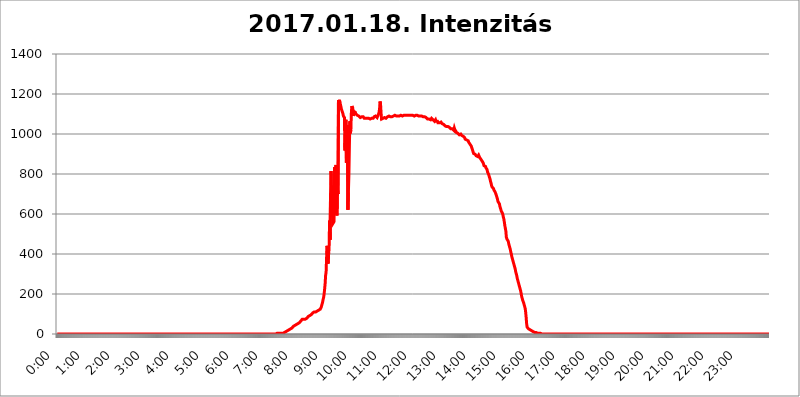
| Category | 2017.01.18. Intenzitás [W/m^2] |
|---|---|
| 0.0 | 0 |
| 0.0006944444444444445 | 0 |
| 0.001388888888888889 | 0 |
| 0.0020833333333333333 | 0 |
| 0.002777777777777778 | 0 |
| 0.003472222222222222 | 0 |
| 0.004166666666666667 | 0 |
| 0.004861111111111111 | 0 |
| 0.005555555555555556 | 0 |
| 0.0062499999999999995 | 0 |
| 0.006944444444444444 | 0 |
| 0.007638888888888889 | 0 |
| 0.008333333333333333 | 0 |
| 0.009027777777777779 | 0 |
| 0.009722222222222222 | 0 |
| 0.010416666666666666 | 0 |
| 0.011111111111111112 | 0 |
| 0.011805555555555555 | 0 |
| 0.012499999999999999 | 0 |
| 0.013194444444444444 | 0 |
| 0.013888888888888888 | 0 |
| 0.014583333333333332 | 0 |
| 0.015277777777777777 | 0 |
| 0.015972222222222224 | 0 |
| 0.016666666666666666 | 0 |
| 0.017361111111111112 | 0 |
| 0.018055555555555557 | 0 |
| 0.01875 | 0 |
| 0.019444444444444445 | 0 |
| 0.02013888888888889 | 0 |
| 0.020833333333333332 | 0 |
| 0.02152777777777778 | 0 |
| 0.022222222222222223 | 0 |
| 0.02291666666666667 | 0 |
| 0.02361111111111111 | 0 |
| 0.024305555555555556 | 0 |
| 0.024999999999999998 | 0 |
| 0.025694444444444447 | 0 |
| 0.02638888888888889 | 0 |
| 0.027083333333333334 | 0 |
| 0.027777777777777776 | 0 |
| 0.02847222222222222 | 0 |
| 0.029166666666666664 | 0 |
| 0.029861111111111113 | 0 |
| 0.030555555555555555 | 0 |
| 0.03125 | 0 |
| 0.03194444444444445 | 0 |
| 0.03263888888888889 | 0 |
| 0.03333333333333333 | 0 |
| 0.034027777777777775 | 0 |
| 0.034722222222222224 | 0 |
| 0.035416666666666666 | 0 |
| 0.036111111111111115 | 0 |
| 0.03680555555555556 | 0 |
| 0.0375 | 0 |
| 0.03819444444444444 | 0 |
| 0.03888888888888889 | 0 |
| 0.03958333333333333 | 0 |
| 0.04027777777777778 | 0 |
| 0.04097222222222222 | 0 |
| 0.041666666666666664 | 0 |
| 0.042361111111111106 | 0 |
| 0.04305555555555556 | 0 |
| 0.043750000000000004 | 0 |
| 0.044444444444444446 | 0 |
| 0.04513888888888889 | 0 |
| 0.04583333333333334 | 0 |
| 0.04652777777777778 | 0 |
| 0.04722222222222222 | 0 |
| 0.04791666666666666 | 0 |
| 0.04861111111111111 | 0 |
| 0.049305555555555554 | 0 |
| 0.049999999999999996 | 0 |
| 0.05069444444444445 | 0 |
| 0.051388888888888894 | 0 |
| 0.052083333333333336 | 0 |
| 0.05277777777777778 | 0 |
| 0.05347222222222222 | 0 |
| 0.05416666666666667 | 0 |
| 0.05486111111111111 | 0 |
| 0.05555555555555555 | 0 |
| 0.05625 | 0 |
| 0.05694444444444444 | 0 |
| 0.057638888888888885 | 0 |
| 0.05833333333333333 | 0 |
| 0.05902777777777778 | 0 |
| 0.059722222222222225 | 0 |
| 0.06041666666666667 | 0 |
| 0.061111111111111116 | 0 |
| 0.06180555555555556 | 0 |
| 0.0625 | 0 |
| 0.06319444444444444 | 0 |
| 0.06388888888888888 | 0 |
| 0.06458333333333334 | 0 |
| 0.06527777777777778 | 0 |
| 0.06597222222222222 | 0 |
| 0.06666666666666667 | 0 |
| 0.06736111111111111 | 0 |
| 0.06805555555555555 | 0 |
| 0.06874999999999999 | 0 |
| 0.06944444444444443 | 0 |
| 0.07013888888888889 | 0 |
| 0.07083333333333333 | 0 |
| 0.07152777777777779 | 0 |
| 0.07222222222222223 | 0 |
| 0.07291666666666667 | 0 |
| 0.07361111111111111 | 0 |
| 0.07430555555555556 | 0 |
| 0.075 | 0 |
| 0.07569444444444444 | 0 |
| 0.0763888888888889 | 0 |
| 0.07708333333333334 | 0 |
| 0.07777777777777778 | 0 |
| 0.07847222222222222 | 0 |
| 0.07916666666666666 | 0 |
| 0.0798611111111111 | 0 |
| 0.08055555555555556 | 0 |
| 0.08125 | 0 |
| 0.08194444444444444 | 0 |
| 0.08263888888888889 | 0 |
| 0.08333333333333333 | 0 |
| 0.08402777777777777 | 0 |
| 0.08472222222222221 | 0 |
| 0.08541666666666665 | 0 |
| 0.08611111111111112 | 0 |
| 0.08680555555555557 | 0 |
| 0.08750000000000001 | 0 |
| 0.08819444444444445 | 0 |
| 0.08888888888888889 | 0 |
| 0.08958333333333333 | 0 |
| 0.09027777777777778 | 0 |
| 0.09097222222222222 | 0 |
| 0.09166666666666667 | 0 |
| 0.09236111111111112 | 0 |
| 0.09305555555555556 | 0 |
| 0.09375 | 0 |
| 0.09444444444444444 | 0 |
| 0.09513888888888888 | 0 |
| 0.09583333333333333 | 0 |
| 0.09652777777777777 | 0 |
| 0.09722222222222222 | 0 |
| 0.09791666666666667 | 0 |
| 0.09861111111111111 | 0 |
| 0.09930555555555555 | 0 |
| 0.09999999999999999 | 0 |
| 0.10069444444444443 | 0 |
| 0.1013888888888889 | 0 |
| 0.10208333333333335 | 0 |
| 0.10277777777777779 | 0 |
| 0.10347222222222223 | 0 |
| 0.10416666666666667 | 0 |
| 0.10486111111111111 | 0 |
| 0.10555555555555556 | 0 |
| 0.10625 | 0 |
| 0.10694444444444444 | 0 |
| 0.1076388888888889 | 0 |
| 0.10833333333333334 | 0 |
| 0.10902777777777778 | 0 |
| 0.10972222222222222 | 0 |
| 0.1111111111111111 | 0 |
| 0.11180555555555556 | 0 |
| 0.11180555555555556 | 0 |
| 0.1125 | 0 |
| 0.11319444444444444 | 0 |
| 0.11388888888888889 | 0 |
| 0.11458333333333333 | 0 |
| 0.11527777777777777 | 0 |
| 0.11597222222222221 | 0 |
| 0.11666666666666665 | 0 |
| 0.1173611111111111 | 0 |
| 0.11805555555555557 | 0 |
| 0.11944444444444445 | 0 |
| 0.12013888888888889 | 0 |
| 0.12083333333333333 | 0 |
| 0.12152777777777778 | 0 |
| 0.12222222222222223 | 0 |
| 0.12291666666666667 | 0 |
| 0.12291666666666667 | 0 |
| 0.12361111111111112 | 0 |
| 0.12430555555555556 | 0 |
| 0.125 | 0 |
| 0.12569444444444444 | 0 |
| 0.12638888888888888 | 0 |
| 0.12708333333333333 | 0 |
| 0.16875 | 0 |
| 0.12847222222222224 | 0 |
| 0.12916666666666668 | 0 |
| 0.12986111111111112 | 0 |
| 0.13055555555555556 | 0 |
| 0.13125 | 0 |
| 0.13194444444444445 | 0 |
| 0.1326388888888889 | 0 |
| 0.13333333333333333 | 0 |
| 0.13402777777777777 | 0 |
| 0.13402777777777777 | 0 |
| 0.13472222222222222 | 0 |
| 0.13541666666666666 | 0 |
| 0.1361111111111111 | 0 |
| 0.13749999999999998 | 0 |
| 0.13819444444444443 | 0 |
| 0.1388888888888889 | 0 |
| 0.13958333333333334 | 0 |
| 0.14027777777777778 | 0 |
| 0.14097222222222222 | 0 |
| 0.14166666666666666 | 0 |
| 0.1423611111111111 | 0 |
| 0.14305555555555557 | 0 |
| 0.14375000000000002 | 0 |
| 0.14444444444444446 | 0 |
| 0.1451388888888889 | 0 |
| 0.1451388888888889 | 0 |
| 0.14652777777777778 | 0 |
| 0.14722222222222223 | 0 |
| 0.14791666666666667 | 0 |
| 0.1486111111111111 | 0 |
| 0.14930555555555555 | 0 |
| 0.15 | 0 |
| 0.15069444444444444 | 0 |
| 0.15138888888888888 | 0 |
| 0.15208333333333332 | 0 |
| 0.15277777777777776 | 0 |
| 0.15347222222222223 | 0 |
| 0.15416666666666667 | 0 |
| 0.15486111111111112 | 0 |
| 0.15555555555555556 | 0 |
| 0.15625 | 0 |
| 0.15694444444444444 | 0 |
| 0.15763888888888888 | 0 |
| 0.15833333333333333 | 0 |
| 0.15902777777777777 | 0 |
| 0.15972222222222224 | 0 |
| 0.16041666666666668 | 0 |
| 0.16111111111111112 | 0 |
| 0.16180555555555556 | 0 |
| 0.1625 | 0 |
| 0.16319444444444445 | 0 |
| 0.1638888888888889 | 0 |
| 0.16458333333333333 | 0 |
| 0.16527777777777777 | 0 |
| 0.16597222222222222 | 0 |
| 0.16666666666666666 | 0 |
| 0.1673611111111111 | 0 |
| 0.16805555555555554 | 0 |
| 0.16874999999999998 | 0 |
| 0.16944444444444443 | 0 |
| 0.17013888888888887 | 0 |
| 0.1708333333333333 | 0 |
| 0.17152777777777775 | 0 |
| 0.17222222222222225 | 0 |
| 0.1729166666666667 | 0 |
| 0.17361111111111113 | 0 |
| 0.17430555555555557 | 0 |
| 0.17500000000000002 | 0 |
| 0.17569444444444446 | 0 |
| 0.1763888888888889 | 0 |
| 0.17708333333333334 | 0 |
| 0.17777777777777778 | 0 |
| 0.17847222222222223 | 0 |
| 0.17916666666666667 | 0 |
| 0.1798611111111111 | 0 |
| 0.18055555555555555 | 0 |
| 0.18125 | 0 |
| 0.18194444444444444 | 0 |
| 0.1826388888888889 | 0 |
| 0.18333333333333335 | 0 |
| 0.1840277777777778 | 0 |
| 0.18472222222222223 | 0 |
| 0.18541666666666667 | 0 |
| 0.18611111111111112 | 0 |
| 0.18680555555555556 | 0 |
| 0.1875 | 0 |
| 0.18819444444444444 | 0 |
| 0.18888888888888888 | 0 |
| 0.18958333333333333 | 0 |
| 0.19027777777777777 | 0 |
| 0.1909722222222222 | 0 |
| 0.19166666666666665 | 0 |
| 0.19236111111111112 | 0 |
| 0.19305555555555554 | 0 |
| 0.19375 | 0 |
| 0.19444444444444445 | 0 |
| 0.1951388888888889 | 0 |
| 0.19583333333333333 | 0 |
| 0.19652777777777777 | 0 |
| 0.19722222222222222 | 0 |
| 0.19791666666666666 | 0 |
| 0.1986111111111111 | 0 |
| 0.19930555555555554 | 0 |
| 0.19999999999999998 | 0 |
| 0.20069444444444443 | 0 |
| 0.20138888888888887 | 0 |
| 0.2020833333333333 | 0 |
| 0.2027777777777778 | 0 |
| 0.2034722222222222 | 0 |
| 0.2041666666666667 | 0 |
| 0.20486111111111113 | 0 |
| 0.20555555555555557 | 0 |
| 0.20625000000000002 | 0 |
| 0.20694444444444446 | 0 |
| 0.2076388888888889 | 0 |
| 0.20833333333333334 | 0 |
| 0.20902777777777778 | 0 |
| 0.20972222222222223 | 0 |
| 0.21041666666666667 | 0 |
| 0.2111111111111111 | 0 |
| 0.21180555555555555 | 0 |
| 0.2125 | 0 |
| 0.21319444444444444 | 0 |
| 0.2138888888888889 | 0 |
| 0.21458333333333335 | 0 |
| 0.2152777777777778 | 0 |
| 0.21597222222222223 | 0 |
| 0.21666666666666667 | 0 |
| 0.21736111111111112 | 0 |
| 0.21805555555555556 | 0 |
| 0.21875 | 0 |
| 0.21944444444444444 | 0 |
| 0.22013888888888888 | 0 |
| 0.22083333333333333 | 0 |
| 0.22152777777777777 | 0 |
| 0.2222222222222222 | 0 |
| 0.22291666666666665 | 0 |
| 0.2236111111111111 | 0 |
| 0.22430555555555556 | 0 |
| 0.225 | 0 |
| 0.22569444444444445 | 0 |
| 0.2263888888888889 | 0 |
| 0.22708333333333333 | 0 |
| 0.22777777777777777 | 0 |
| 0.22847222222222222 | 0 |
| 0.22916666666666666 | 0 |
| 0.2298611111111111 | 0 |
| 0.23055555555555554 | 0 |
| 0.23124999999999998 | 0 |
| 0.23194444444444443 | 0 |
| 0.23263888888888887 | 0 |
| 0.2333333333333333 | 0 |
| 0.2340277777777778 | 0 |
| 0.2347222222222222 | 0 |
| 0.2354166666666667 | 0 |
| 0.23611111111111113 | 0 |
| 0.23680555555555557 | 0 |
| 0.23750000000000002 | 0 |
| 0.23819444444444446 | 0 |
| 0.2388888888888889 | 0 |
| 0.23958333333333334 | 0 |
| 0.24027777777777778 | 0 |
| 0.24097222222222223 | 0 |
| 0.24166666666666667 | 0 |
| 0.2423611111111111 | 0 |
| 0.24305555555555555 | 0 |
| 0.24375 | 0 |
| 0.24444444444444446 | 0 |
| 0.24513888888888888 | 0 |
| 0.24583333333333335 | 0 |
| 0.2465277777777778 | 0 |
| 0.24722222222222223 | 0 |
| 0.24791666666666667 | 0 |
| 0.24861111111111112 | 0 |
| 0.24930555555555556 | 0 |
| 0.25 | 0 |
| 0.25069444444444444 | 0 |
| 0.2513888888888889 | 0 |
| 0.2520833333333333 | 0 |
| 0.25277777777777777 | 0 |
| 0.2534722222222222 | 0 |
| 0.25416666666666665 | 0 |
| 0.2548611111111111 | 0 |
| 0.2555555555555556 | 0 |
| 0.25625000000000003 | 0 |
| 0.2569444444444445 | 0 |
| 0.2576388888888889 | 0 |
| 0.25833333333333336 | 0 |
| 0.2590277777777778 | 0 |
| 0.25972222222222224 | 0 |
| 0.2604166666666667 | 0 |
| 0.2611111111111111 | 0 |
| 0.26180555555555557 | 0 |
| 0.2625 | 0 |
| 0.26319444444444445 | 0 |
| 0.2638888888888889 | 0 |
| 0.26458333333333334 | 0 |
| 0.2652777777777778 | 0 |
| 0.2659722222222222 | 0 |
| 0.26666666666666666 | 0 |
| 0.2673611111111111 | 0 |
| 0.26805555555555555 | 0 |
| 0.26875 | 0 |
| 0.26944444444444443 | 0 |
| 0.2701388888888889 | 0 |
| 0.2708333333333333 | 0 |
| 0.27152777777777776 | 0 |
| 0.2722222222222222 | 0 |
| 0.27291666666666664 | 0 |
| 0.2736111111111111 | 0 |
| 0.2743055555555555 | 0 |
| 0.27499999999999997 | 0 |
| 0.27569444444444446 | 0 |
| 0.27638888888888885 | 0 |
| 0.27708333333333335 | 0 |
| 0.2777777777777778 | 0 |
| 0.27847222222222223 | 0 |
| 0.2791666666666667 | 0 |
| 0.2798611111111111 | 0 |
| 0.28055555555555556 | 0 |
| 0.28125 | 0 |
| 0.28194444444444444 | 0 |
| 0.2826388888888889 | 0 |
| 0.2833333333333333 | 0 |
| 0.28402777777777777 | 0 |
| 0.2847222222222222 | 0 |
| 0.28541666666666665 | 0 |
| 0.28611111111111115 | 0 |
| 0.28680555555555554 | 0 |
| 0.28750000000000003 | 0 |
| 0.2881944444444445 | 0 |
| 0.2888888888888889 | 0 |
| 0.28958333333333336 | 0 |
| 0.2902777777777778 | 0 |
| 0.29097222222222224 | 0 |
| 0.2916666666666667 | 0 |
| 0.2923611111111111 | 0 |
| 0.29305555555555557 | 0 |
| 0.29375 | 0 |
| 0.29444444444444445 | 0 |
| 0.2951388888888889 | 0 |
| 0.29583333333333334 | 0 |
| 0.2965277777777778 | 0 |
| 0.2972222222222222 | 0 |
| 0.29791666666666666 | 0 |
| 0.2986111111111111 | 0 |
| 0.29930555555555555 | 0 |
| 0.3 | 0 |
| 0.30069444444444443 | 0 |
| 0.3013888888888889 | 0 |
| 0.3020833333333333 | 0 |
| 0.30277777777777776 | 0 |
| 0.3034722222222222 | 0 |
| 0.30416666666666664 | 0 |
| 0.3048611111111111 | 0 |
| 0.3055555555555555 | 3.525 |
| 0.30624999999999997 | 0 |
| 0.3069444444444444 | 3.525 |
| 0.3076388888888889 | 0 |
| 0.30833333333333335 | 3.525 |
| 0.3090277777777778 | 3.525 |
| 0.30972222222222223 | 3.525 |
| 0.3104166666666667 | 3.525 |
| 0.3111111111111111 | 3.525 |
| 0.31180555555555556 | 3.525 |
| 0.3125 | 3.525 |
| 0.31319444444444444 | 3.525 |
| 0.3138888888888889 | 3.525 |
| 0.3145833333333333 | 3.525 |
| 0.31527777777777777 | 3.525 |
| 0.3159722222222222 | 3.525 |
| 0.31666666666666665 | 3.525 |
| 0.31736111111111115 | 3.525 |
| 0.31805555555555554 | 3.525 |
| 0.31875000000000003 | 7.887 |
| 0.3194444444444445 | 7.887 |
| 0.3201388888888889 | 7.887 |
| 0.32083333333333336 | 12.257 |
| 0.3215277777777778 | 12.257 |
| 0.32222222222222224 | 12.257 |
| 0.3229166666666667 | 16.636 |
| 0.3236111111111111 | 16.636 |
| 0.32430555555555557 | 16.636 |
| 0.325 | 21.024 |
| 0.32569444444444445 | 21.024 |
| 0.3263888888888889 | 25.419 |
| 0.32708333333333334 | 25.419 |
| 0.3277777777777778 | 25.419 |
| 0.3284722222222222 | 29.823 |
| 0.32916666666666666 | 29.823 |
| 0.3298611111111111 | 34.234 |
| 0.33055555555555555 | 34.234 |
| 0.33125 | 38.653 |
| 0.33194444444444443 | 38.653 |
| 0.3326388888888889 | 43.079 |
| 0.3333333333333333 | 43.079 |
| 0.3340277777777778 | 47.511 |
| 0.3347222222222222 | 47.511 |
| 0.3354166666666667 | 47.511 |
| 0.3361111111111111 | 51.951 |
| 0.3368055555555556 | 51.951 |
| 0.33749999999999997 | 51.951 |
| 0.33819444444444446 | 56.398 |
| 0.33888888888888885 | 56.398 |
| 0.33958333333333335 | 56.398 |
| 0.34027777777777773 | 60.85 |
| 0.34097222222222223 | 60.85 |
| 0.3416666666666666 | 65.31 |
| 0.3423611111111111 | 65.31 |
| 0.3430555555555555 | 69.775 |
| 0.34375 | 74.246 |
| 0.3444444444444445 | 74.246 |
| 0.3451388888888889 | 74.246 |
| 0.3458333333333334 | 74.246 |
| 0.34652777777777777 | 74.246 |
| 0.34722222222222227 | 74.246 |
| 0.34791666666666665 | 74.246 |
| 0.34861111111111115 | 74.246 |
| 0.34930555555555554 | 78.722 |
| 0.35000000000000003 | 78.722 |
| 0.3506944444444444 | 83.205 |
| 0.3513888888888889 | 83.205 |
| 0.3520833333333333 | 87.692 |
| 0.3527777777777778 | 87.692 |
| 0.3534722222222222 | 92.184 |
| 0.3541666666666667 | 92.184 |
| 0.3548611111111111 | 96.682 |
| 0.35555555555555557 | 96.682 |
| 0.35625 | 96.682 |
| 0.35694444444444445 | 101.184 |
| 0.3576388888888889 | 101.184 |
| 0.35833333333333334 | 105.69 |
| 0.3590277777777778 | 110.201 |
| 0.3597222222222222 | 110.201 |
| 0.36041666666666666 | 110.201 |
| 0.3611111111111111 | 110.201 |
| 0.36180555555555555 | 110.201 |
| 0.3625 | 110.201 |
| 0.36319444444444443 | 114.716 |
| 0.3638888888888889 | 114.716 |
| 0.3645833333333333 | 114.716 |
| 0.3652777777777778 | 119.235 |
| 0.3659722222222222 | 119.235 |
| 0.3666666666666667 | 119.235 |
| 0.3673611111111111 | 119.235 |
| 0.3680555555555556 | 123.758 |
| 0.36874999999999997 | 123.758 |
| 0.36944444444444446 | 128.284 |
| 0.37013888888888885 | 132.814 |
| 0.37083333333333335 | 141.884 |
| 0.37152777777777773 | 150.964 |
| 0.37222222222222223 | 160.056 |
| 0.3729166666666666 | 173.709 |
| 0.3736111111111111 | 182.82 |
| 0.3743055555555555 | 201.058 |
| 0.375 | 223.873 |
| 0.3756944444444445 | 251.251 |
| 0.3763888888888889 | 292.259 |
| 0.3770833333333334 | 310.44 |
| 0.37777777777777777 | 382.715 |
| 0.37847222222222227 | 440.702 |
| 0.37916666666666665 | 364.728 |
| 0.37986111111111115 | 351.198 |
| 0.38055555555555554 | 396.164 |
| 0.38125000000000003 | 427.39 |
| 0.3819444444444444 | 566.793 |
| 0.3826388888888889 | 471.582 |
| 0.3833333333333333 | 703.762 |
| 0.3840277777777778 | 814.519 |
| 0.3847222222222222 | 703.762 |
| 0.3854166666666667 | 583.779 |
| 0.3861111111111111 | 683.473 |
| 0.38680555555555557 | 553.986 |
| 0.3875 | 549.704 |
| 0.38819444444444445 | 562.53 |
| 0.3888888888888889 | 833.834 |
| 0.38958333333333334 | 675.311 |
| 0.3902777777777778 | 775.492 |
| 0.3909722222222222 | 845.365 |
| 0.39166666666666666 | 604.864 |
| 0.3923611111111111 | 592.233 |
| 0.39305555555555555 | 723.889 |
| 0.39375 | 699.717 |
| 0.39444444444444443 | 1170.358 |
| 0.3951388888888889 | 1154.814 |
| 0.3958333333333333 | 1170.358 |
| 0.3965277777777778 | 1154.814 |
| 0.3972222222222222 | 1147.086 |
| 0.3979166666666667 | 1135.543 |
| 0.3986111111111111 | 1124.056 |
| 0.3993055555555556 | 1116.426 |
| 0.39999999999999997 | 1108.816 |
| 0.40069444444444446 | 1101.226 |
| 0.40138888888888885 | 1089.873 |
| 0.40208333333333335 | 1086.097 |
| 0.40277777777777773 | 1082.324 |
| 0.40347222222222223 | 917.534 |
| 0.4041666666666666 | 1007.383 |
| 0.4048611111111111 | 1071.027 |
| 0.4055555555555555 | 856.855 |
| 0.40625 | 947.58 |
| 0.4069444444444445 | 1044.762 |
| 0.4076388888888889 | 621.613 |
| 0.4083333333333334 | 707.8 |
| 0.40902777777777777 | 795.074 |
| 0.40972222222222227 | 940.082 |
| 0.41041666666666665 | 1063.51 |
| 0.41111111111111115 | 1003.65 |
| 0.41180555555555554 | 1022.323 |
| 0.41250000000000003 | 1105.019 |
| 0.4131944444444444 | 1139.384 |
| 0.4138888888888889 | 1135.543 |
| 0.4145833333333333 | 1127.879 |
| 0.4152777777777778 | 1089.873 |
| 0.4159722222222222 | 1112.618 |
| 0.4166666666666667 | 1108.816 |
| 0.4173611111111111 | 1108.816 |
| 0.41805555555555557 | 1108.816 |
| 0.41875 | 1101.226 |
| 0.41944444444444445 | 1101.226 |
| 0.4201388888888889 | 1097.437 |
| 0.42083333333333334 | 1093.653 |
| 0.4215277777777778 | 1089.873 |
| 0.4222222222222222 | 1093.653 |
| 0.42291666666666666 | 1089.873 |
| 0.4236111111111111 | 1086.097 |
| 0.42430555555555555 | 1089.873 |
| 0.425 | 1082.324 |
| 0.42569444444444443 | 1086.097 |
| 0.4263888888888889 | 1086.097 |
| 0.4270833333333333 | 1086.097 |
| 0.4277777777777778 | 1086.097 |
| 0.4284722222222222 | 1086.097 |
| 0.4291666666666667 | 1086.097 |
| 0.4298611111111111 | 1086.097 |
| 0.4305555555555556 | 1078.555 |
| 0.43124999999999997 | 1082.324 |
| 0.43194444444444446 | 1078.555 |
| 0.43263888888888885 | 1078.555 |
| 0.43333333333333335 | 1082.324 |
| 0.43402777777777773 | 1082.324 |
| 0.43472222222222223 | 1078.555 |
| 0.4354166666666666 | 1078.555 |
| 0.4361111111111111 | 1078.555 |
| 0.4368055555555555 | 1078.555 |
| 0.4375 | 1078.555 |
| 0.4381944444444445 | 1082.324 |
| 0.4388888888888889 | 1074.789 |
| 0.4395833333333334 | 1074.789 |
| 0.44027777777777777 | 1074.789 |
| 0.44097222222222227 | 1078.555 |
| 0.44166666666666665 | 1078.555 |
| 0.44236111111111115 | 1082.324 |
| 0.44305555555555554 | 1078.555 |
| 0.44375000000000003 | 1082.324 |
| 0.4444444444444444 | 1086.097 |
| 0.4451388888888889 | 1082.324 |
| 0.4458333333333333 | 1086.097 |
| 0.4465277777777778 | 1089.873 |
| 0.4472222222222222 | 1086.097 |
| 0.4479166666666667 | 1086.097 |
| 0.4486111111111111 | 1082.324 |
| 0.44930555555555557 | 1086.097 |
| 0.45 | 1093.653 |
| 0.45069444444444445 | 1101.226 |
| 0.4513888888888889 | 1108.816 |
| 0.45208333333333334 | 1127.879 |
| 0.4527777777777778 | 1162.571 |
| 0.4534722222222222 | 1147.086 |
| 0.45416666666666666 | 1105.019 |
| 0.4548611111111111 | 1074.789 |
| 0.45555555555555555 | 1074.789 |
| 0.45625 | 1074.789 |
| 0.45694444444444443 | 1078.555 |
| 0.4576388888888889 | 1082.324 |
| 0.4583333333333333 | 1078.555 |
| 0.4590277777777778 | 1082.324 |
| 0.4597222222222222 | 1078.555 |
| 0.4604166666666667 | 1078.555 |
| 0.4611111111111111 | 1078.555 |
| 0.4618055555555556 | 1082.324 |
| 0.46249999999999997 | 1082.324 |
| 0.46319444444444446 | 1086.097 |
| 0.46388888888888885 | 1086.097 |
| 0.46458333333333335 | 1086.097 |
| 0.46527777777777773 | 1089.873 |
| 0.46597222222222223 | 1086.097 |
| 0.4666666666666666 | 1086.097 |
| 0.4673611111111111 | 1086.097 |
| 0.4680555555555555 | 1086.097 |
| 0.46875 | 1086.097 |
| 0.4694444444444445 | 1086.097 |
| 0.4701388888888889 | 1086.097 |
| 0.4708333333333334 | 1086.097 |
| 0.47152777777777777 | 1089.873 |
| 0.47222222222222227 | 1093.653 |
| 0.47291666666666665 | 1089.873 |
| 0.47361111111111115 | 1093.653 |
| 0.47430555555555554 | 1089.873 |
| 0.47500000000000003 | 1089.873 |
| 0.4756944444444444 | 1089.873 |
| 0.4763888888888889 | 1093.653 |
| 0.4770833333333333 | 1093.653 |
| 0.4777777777777778 | 1089.873 |
| 0.4784722222222222 | 1093.653 |
| 0.4791666666666667 | 1089.873 |
| 0.4798611111111111 | 1089.873 |
| 0.48055555555555557 | 1093.653 |
| 0.48125 | 1093.653 |
| 0.48194444444444445 | 1093.653 |
| 0.4826388888888889 | 1093.653 |
| 0.48333333333333334 | 1093.653 |
| 0.4840277777777778 | 1089.873 |
| 0.4847222222222222 | 1093.653 |
| 0.48541666666666666 | 1089.873 |
| 0.4861111111111111 | 1093.653 |
| 0.48680555555555555 | 1097.437 |
| 0.4875 | 1097.437 |
| 0.48819444444444443 | 1093.653 |
| 0.4888888888888889 | 1093.653 |
| 0.4895833333333333 | 1097.437 |
| 0.4902777777777778 | 1093.653 |
| 0.4909722222222222 | 1093.653 |
| 0.4916666666666667 | 1089.873 |
| 0.4923611111111111 | 1093.653 |
| 0.4930555555555556 | 1093.653 |
| 0.49374999999999997 | 1093.653 |
| 0.49444444444444446 | 1093.653 |
| 0.49513888888888885 | 1093.653 |
| 0.49583333333333335 | 1093.653 |
| 0.49652777777777773 | 1093.653 |
| 0.49722222222222223 | 1093.653 |
| 0.4979166666666666 | 1093.653 |
| 0.4986111111111111 | 1093.653 |
| 0.4993055555555555 | 1093.653 |
| 0.5 | 1089.873 |
| 0.5006944444444444 | 1089.873 |
| 0.5013888888888889 | 1093.653 |
| 0.5020833333333333 | 1089.873 |
| 0.5027777777777778 | 1093.653 |
| 0.5034722222222222 | 1093.653 |
| 0.5041666666666667 | 1089.873 |
| 0.5048611111111111 | 1093.653 |
| 0.5055555555555555 | 1089.873 |
| 0.50625 | 1089.873 |
| 0.5069444444444444 | 1089.873 |
| 0.5076388888888889 | 1089.873 |
| 0.5083333333333333 | 1089.873 |
| 0.5090277777777777 | 1089.873 |
| 0.5097222222222222 | 1086.097 |
| 0.5104166666666666 | 1089.873 |
| 0.5111111111111112 | 1089.873 |
| 0.5118055555555555 | 1086.097 |
| 0.5125000000000001 | 1086.097 |
| 0.5131944444444444 | 1086.097 |
| 0.513888888888889 | 1086.097 |
| 0.5145833333333333 | 1086.097 |
| 0.5152777777777778 | 1086.097 |
| 0.5159722222222222 | 1086.097 |
| 0.5166666666666667 | 1086.097 |
| 0.517361111111111 | 1082.324 |
| 0.5180555555555556 | 1078.555 |
| 0.5187499999999999 | 1078.555 |
| 0.5194444444444445 | 1074.789 |
| 0.5201388888888888 | 1074.789 |
| 0.5208333333333334 | 1074.789 |
| 0.5215277777777778 | 1074.789 |
| 0.5222222222222223 | 1074.789 |
| 0.5229166666666667 | 1071.027 |
| 0.5236111111111111 | 1071.027 |
| 0.5243055555555556 | 1074.789 |
| 0.525 | 1078.555 |
| 0.5256944444444445 | 1078.555 |
| 0.5263888888888889 | 1078.555 |
| 0.5270833333333333 | 1071.027 |
| 0.5277777777777778 | 1071.027 |
| 0.5284722222222222 | 1067.267 |
| 0.5291666666666667 | 1063.51 |
| 0.5298611111111111 | 1063.51 |
| 0.5305555555555556 | 1071.027 |
| 0.53125 | 1063.51 |
| 0.5319444444444444 | 1059.756 |
| 0.5326388888888889 | 1059.756 |
| 0.5333333333333333 | 1063.51 |
| 0.5340277777777778 | 1056.004 |
| 0.5347222222222222 | 1059.756 |
| 0.5354166666666667 | 1059.756 |
| 0.5361111111111111 | 1056.004 |
| 0.5368055555555555 | 1059.756 |
| 0.5375 | 1059.756 |
| 0.5381944444444444 | 1059.756 |
| 0.5388888888888889 | 1056.004 |
| 0.5395833333333333 | 1052.255 |
| 0.5402777777777777 | 1056.004 |
| 0.5409722222222222 | 1052.255 |
| 0.5416666666666666 | 1048.508 |
| 0.5423611111111112 | 1048.508 |
| 0.5430555555555555 | 1048.508 |
| 0.5437500000000001 | 1041.019 |
| 0.5444444444444444 | 1037.277 |
| 0.545138888888889 | 1041.019 |
| 0.5458333333333333 | 1037.277 |
| 0.5465277777777778 | 1037.277 |
| 0.5472222222222222 | 1037.277 |
| 0.5479166666666667 | 1037.277 |
| 0.548611111111111 | 1037.277 |
| 0.5493055555555556 | 1037.277 |
| 0.5499999999999999 | 1033.537 |
| 0.5506944444444445 | 1033.537 |
| 0.5513888888888888 | 1029.798 |
| 0.5520833333333334 | 1026.06 |
| 0.5527777777777778 | 1022.323 |
| 0.5534722222222223 | 1022.323 |
| 0.5541666666666667 | 1026.06 |
| 0.5548611111111111 | 1026.06 |
| 0.5555555555555556 | 1026.06 |
| 0.55625 | 1018.587 |
| 0.5569444444444445 | 1029.798 |
| 0.5576388888888889 | 1022.323 |
| 0.5583333333333333 | 1018.587 |
| 0.5590277777777778 | 1014.852 |
| 0.5597222222222222 | 1007.383 |
| 0.5604166666666667 | 1007.383 |
| 0.5611111111111111 | 1003.65 |
| 0.5618055555555556 | 1003.65 |
| 0.5625 | 1003.65 |
| 0.5631944444444444 | 999.916 |
| 0.5638888888888889 | 996.182 |
| 0.5645833333333333 | 999.916 |
| 0.5652777777777778 | 996.182 |
| 0.5659722222222222 | 999.916 |
| 0.5666666666666667 | 996.182 |
| 0.5673611111111111 | 992.448 |
| 0.5680555555555555 | 992.448 |
| 0.56875 | 992.448 |
| 0.5694444444444444 | 988.714 |
| 0.5701388888888889 | 984.98 |
| 0.5708333333333333 | 984.98 |
| 0.5715277777777777 | 981.244 |
| 0.5722222222222222 | 973.772 |
| 0.5729166666666666 | 970.034 |
| 0.5736111111111112 | 970.034 |
| 0.5743055555555555 | 970.034 |
| 0.5750000000000001 | 970.034 |
| 0.5756944444444444 | 966.295 |
| 0.576388888888889 | 966.295 |
| 0.5770833333333333 | 958.814 |
| 0.5777777777777778 | 958.814 |
| 0.5784722222222222 | 955.071 |
| 0.5791666666666667 | 947.58 |
| 0.579861111111111 | 943.832 |
| 0.5805555555555556 | 940.082 |
| 0.5812499999999999 | 932.576 |
| 0.5819444444444445 | 925.06 |
| 0.5826388888888888 | 917.534 |
| 0.5833333333333334 | 909.996 |
| 0.5840277777777778 | 902.447 |
| 0.5847222222222223 | 898.668 |
| 0.5854166666666667 | 898.668 |
| 0.5861111111111111 | 898.668 |
| 0.5868055555555556 | 894.885 |
| 0.5875 | 891.099 |
| 0.5881944444444445 | 887.309 |
| 0.5888888888888889 | 887.309 |
| 0.5895833333333333 | 887.309 |
| 0.5902777777777778 | 891.099 |
| 0.5909722222222222 | 894.885 |
| 0.5916666666666667 | 891.099 |
| 0.5923611111111111 | 883.516 |
| 0.5930555555555556 | 879.719 |
| 0.59375 | 879.719 |
| 0.5944444444444444 | 872.114 |
| 0.5951388888888889 | 868.305 |
| 0.5958333333333333 | 864.493 |
| 0.5965277777777778 | 860.676 |
| 0.5972222222222222 | 856.855 |
| 0.5979166666666667 | 849.199 |
| 0.5986111111111111 | 841.526 |
| 0.5993055555555555 | 845.365 |
| 0.6 | 845.365 |
| 0.6006944444444444 | 837.682 |
| 0.6013888888888889 | 829.981 |
| 0.6020833333333333 | 826.123 |
| 0.6027777777777777 | 822.26 |
| 0.6034722222222222 | 810.641 |
| 0.6041666666666666 | 806.757 |
| 0.6048611111111112 | 798.974 |
| 0.6055555555555555 | 791.169 |
| 0.6062500000000001 | 783.342 |
| 0.6069444444444444 | 775.492 |
| 0.607638888888889 | 763.674 |
| 0.6083333333333333 | 755.766 |
| 0.6090277777777778 | 743.859 |
| 0.6097222222222222 | 735.89 |
| 0.6104166666666667 | 739.877 |
| 0.611111111111111 | 731.896 |
| 0.6118055555555556 | 727.896 |
| 0.6124999999999999 | 719.877 |
| 0.6131944444444445 | 715.858 |
| 0.6138888888888888 | 711.832 |
| 0.6145833333333334 | 711.832 |
| 0.6152777777777778 | 699.717 |
| 0.6159722222222223 | 691.608 |
| 0.6166666666666667 | 683.473 |
| 0.6173611111111111 | 675.311 |
| 0.6180555555555556 | 663.019 |
| 0.61875 | 658.909 |
| 0.6194444444444445 | 658.909 |
| 0.6201388888888889 | 650.667 |
| 0.6208333333333333 | 638.256 |
| 0.6215277777777778 | 629.948 |
| 0.6222222222222222 | 621.613 |
| 0.6229166666666667 | 613.252 |
| 0.6236111111111111 | 609.062 |
| 0.6243055555555556 | 604.864 |
| 0.625 | 596.45 |
| 0.6256944444444444 | 583.779 |
| 0.6263888888888889 | 575.299 |
| 0.6270833333333333 | 558.261 |
| 0.6277777777777778 | 541.121 |
| 0.6284722222222222 | 528.2 |
| 0.6291666666666667 | 515.223 |
| 0.6298611111111111 | 484.735 |
| 0.6305555555555555 | 475.972 |
| 0.63125 | 480.356 |
| 0.6319444444444444 | 471.582 |
| 0.6326388888888889 | 462.786 |
| 0.6333333333333333 | 449.551 |
| 0.6340277777777777 | 440.702 |
| 0.6347222222222222 | 431.833 |
| 0.6354166666666666 | 422.943 |
| 0.6361111111111112 | 409.574 |
| 0.6368055555555555 | 400.638 |
| 0.6375000000000001 | 387.202 |
| 0.6381944444444444 | 378.224 |
| 0.638888888888889 | 369.23 |
| 0.6395833333333333 | 360.221 |
| 0.6402777777777778 | 351.198 |
| 0.6409722222222222 | 342.162 |
| 0.6416666666666667 | 333.113 |
| 0.642361111111111 | 324.052 |
| 0.6430555555555556 | 310.44 |
| 0.6437499999999999 | 301.354 |
| 0.6444444444444445 | 292.259 |
| 0.6451388888888888 | 278.603 |
| 0.6458333333333334 | 269.49 |
| 0.6465277777777778 | 260.373 |
| 0.6472222222222223 | 251.251 |
| 0.6479166666666667 | 242.127 |
| 0.6486111111111111 | 233 |
| 0.6493055555555556 | 223.873 |
| 0.65 | 214.746 |
| 0.6506944444444445 | 201.058 |
| 0.6513888888888889 | 187.378 |
| 0.6520833333333333 | 178.264 |
| 0.6527777777777778 | 169.156 |
| 0.6534722222222222 | 164.605 |
| 0.6541666666666667 | 155.509 |
| 0.6548611111111111 | 146.423 |
| 0.6555555555555556 | 137.347 |
| 0.65625 | 128.284 |
| 0.6569444444444444 | 110.201 |
| 0.6576388888888889 | 83.205 |
| 0.6583333333333333 | 51.951 |
| 0.6590277777777778 | 34.234 |
| 0.6597222222222222 | 29.823 |
| 0.6604166666666667 | 29.823 |
| 0.6611111111111111 | 25.419 |
| 0.6618055555555555 | 25.419 |
| 0.6625 | 25.419 |
| 0.6631944444444444 | 21.024 |
| 0.6638888888888889 | 21.024 |
| 0.6645833333333333 | 21.024 |
| 0.6652777777777777 | 16.636 |
| 0.6659722222222222 | 16.636 |
| 0.6666666666666666 | 16.636 |
| 0.6673611111111111 | 12.257 |
| 0.6680555555555556 | 12.257 |
| 0.6687500000000001 | 12.257 |
| 0.6694444444444444 | 7.887 |
| 0.6701388888888888 | 7.887 |
| 0.6708333333333334 | 7.887 |
| 0.6715277777777778 | 7.887 |
| 0.6722222222222222 | 3.525 |
| 0.6729166666666666 | 3.525 |
| 0.6736111111111112 | 3.525 |
| 0.6743055555555556 | 3.525 |
| 0.6749999999999999 | 3.525 |
| 0.6756944444444444 | 3.525 |
| 0.6763888888888889 | 3.525 |
| 0.6770833333333334 | 3.525 |
| 0.6777777777777777 | 3.525 |
| 0.6784722222222223 | 0 |
| 0.6791666666666667 | 0 |
| 0.6798611111111111 | 0 |
| 0.6805555555555555 | 0 |
| 0.68125 | 0 |
| 0.6819444444444445 | 0 |
| 0.6826388888888889 | 0 |
| 0.6833333333333332 | 0 |
| 0.6840277777777778 | 0 |
| 0.6847222222222222 | 0 |
| 0.6854166666666667 | 0 |
| 0.686111111111111 | 0 |
| 0.6868055555555556 | 0 |
| 0.6875 | 0 |
| 0.6881944444444444 | 0 |
| 0.688888888888889 | 0 |
| 0.6895833333333333 | 0 |
| 0.6902777777777778 | 0 |
| 0.6909722222222222 | 0 |
| 0.6916666666666668 | 0 |
| 0.6923611111111111 | 0 |
| 0.6930555555555555 | 0 |
| 0.69375 | 0 |
| 0.6944444444444445 | 0 |
| 0.6951388888888889 | 0 |
| 0.6958333333333333 | 0 |
| 0.6965277777777777 | 0 |
| 0.6972222222222223 | 0 |
| 0.6979166666666666 | 0 |
| 0.6986111111111111 | 0 |
| 0.6993055555555556 | 0 |
| 0.7000000000000001 | 0 |
| 0.7006944444444444 | 0 |
| 0.7013888888888888 | 0 |
| 0.7020833333333334 | 0 |
| 0.7027777777777778 | 0 |
| 0.7034722222222222 | 0 |
| 0.7041666666666666 | 0 |
| 0.7048611111111112 | 0 |
| 0.7055555555555556 | 0 |
| 0.7062499999999999 | 0 |
| 0.7069444444444444 | 0 |
| 0.7076388888888889 | 0 |
| 0.7083333333333334 | 0 |
| 0.7090277777777777 | 0 |
| 0.7097222222222223 | 0 |
| 0.7104166666666667 | 0 |
| 0.7111111111111111 | 0 |
| 0.7118055555555555 | 0 |
| 0.7125 | 0 |
| 0.7131944444444445 | 0 |
| 0.7138888888888889 | 0 |
| 0.7145833333333332 | 0 |
| 0.7152777777777778 | 0 |
| 0.7159722222222222 | 0 |
| 0.7166666666666667 | 0 |
| 0.717361111111111 | 0 |
| 0.7180555555555556 | 0 |
| 0.71875 | 0 |
| 0.7194444444444444 | 0 |
| 0.720138888888889 | 0 |
| 0.7208333333333333 | 0 |
| 0.7215277777777778 | 0 |
| 0.7222222222222222 | 0 |
| 0.7229166666666668 | 0 |
| 0.7236111111111111 | 0 |
| 0.7243055555555555 | 0 |
| 0.725 | 0 |
| 0.7256944444444445 | 0 |
| 0.7263888888888889 | 0 |
| 0.7270833333333333 | 0 |
| 0.7277777777777777 | 0 |
| 0.7284722222222223 | 0 |
| 0.7291666666666666 | 0 |
| 0.7298611111111111 | 0 |
| 0.7305555555555556 | 0 |
| 0.7312500000000001 | 0 |
| 0.7319444444444444 | 0 |
| 0.7326388888888888 | 0 |
| 0.7333333333333334 | 0 |
| 0.7340277777777778 | 0 |
| 0.7347222222222222 | 0 |
| 0.7354166666666666 | 0 |
| 0.7361111111111112 | 0 |
| 0.7368055555555556 | 0 |
| 0.7374999999999999 | 0 |
| 0.7381944444444444 | 0 |
| 0.7388888888888889 | 0 |
| 0.7395833333333334 | 0 |
| 0.7402777777777777 | 0 |
| 0.7409722222222223 | 0 |
| 0.7416666666666667 | 0 |
| 0.7423611111111111 | 0 |
| 0.7430555555555555 | 0 |
| 0.74375 | 0 |
| 0.7444444444444445 | 0 |
| 0.7451388888888889 | 0 |
| 0.7458333333333332 | 0 |
| 0.7465277777777778 | 0 |
| 0.7472222222222222 | 0 |
| 0.7479166666666667 | 0 |
| 0.748611111111111 | 0 |
| 0.7493055555555556 | 0 |
| 0.75 | 0 |
| 0.7506944444444444 | 0 |
| 0.751388888888889 | 0 |
| 0.7520833333333333 | 0 |
| 0.7527777777777778 | 0 |
| 0.7534722222222222 | 0 |
| 0.7541666666666668 | 0 |
| 0.7548611111111111 | 0 |
| 0.7555555555555555 | 0 |
| 0.75625 | 0 |
| 0.7569444444444445 | 0 |
| 0.7576388888888889 | 0 |
| 0.7583333333333333 | 0 |
| 0.7590277777777777 | 0 |
| 0.7597222222222223 | 0 |
| 0.7604166666666666 | 0 |
| 0.7611111111111111 | 0 |
| 0.7618055555555556 | 0 |
| 0.7625000000000001 | 0 |
| 0.7631944444444444 | 0 |
| 0.7638888888888888 | 0 |
| 0.7645833333333334 | 0 |
| 0.7652777777777778 | 0 |
| 0.7659722222222222 | 0 |
| 0.7666666666666666 | 0 |
| 0.7673611111111112 | 0 |
| 0.7680555555555556 | 0 |
| 0.7687499999999999 | 0 |
| 0.7694444444444444 | 0 |
| 0.7701388888888889 | 0 |
| 0.7708333333333334 | 0 |
| 0.7715277777777777 | 0 |
| 0.7722222222222223 | 0 |
| 0.7729166666666667 | 0 |
| 0.7736111111111111 | 0 |
| 0.7743055555555555 | 0 |
| 0.775 | 0 |
| 0.7756944444444445 | 0 |
| 0.7763888888888889 | 0 |
| 0.7770833333333332 | 0 |
| 0.7777777777777778 | 0 |
| 0.7784722222222222 | 0 |
| 0.7791666666666667 | 0 |
| 0.779861111111111 | 0 |
| 0.7805555555555556 | 0 |
| 0.78125 | 0 |
| 0.7819444444444444 | 0 |
| 0.782638888888889 | 0 |
| 0.7833333333333333 | 0 |
| 0.7840277777777778 | 0 |
| 0.7847222222222222 | 0 |
| 0.7854166666666668 | 0 |
| 0.7861111111111111 | 0 |
| 0.7868055555555555 | 0 |
| 0.7875 | 0 |
| 0.7881944444444445 | 0 |
| 0.7888888888888889 | 0 |
| 0.7895833333333333 | 0 |
| 0.7902777777777777 | 0 |
| 0.7909722222222223 | 0 |
| 0.7916666666666666 | 0 |
| 0.7923611111111111 | 0 |
| 0.7930555555555556 | 0 |
| 0.7937500000000001 | 0 |
| 0.7944444444444444 | 0 |
| 0.7951388888888888 | 0 |
| 0.7958333333333334 | 0 |
| 0.7965277777777778 | 0 |
| 0.7972222222222222 | 0 |
| 0.7979166666666666 | 0 |
| 0.7986111111111112 | 0 |
| 0.7993055555555556 | 0 |
| 0.7999999999999999 | 0 |
| 0.8006944444444444 | 0 |
| 0.8013888888888889 | 0 |
| 0.8020833333333334 | 0 |
| 0.8027777777777777 | 0 |
| 0.8034722222222223 | 0 |
| 0.8041666666666667 | 0 |
| 0.8048611111111111 | 0 |
| 0.8055555555555555 | 0 |
| 0.80625 | 0 |
| 0.8069444444444445 | 0 |
| 0.8076388888888889 | 0 |
| 0.8083333333333332 | 0 |
| 0.8090277777777778 | 0 |
| 0.8097222222222222 | 0 |
| 0.8104166666666667 | 0 |
| 0.811111111111111 | 0 |
| 0.8118055555555556 | 0 |
| 0.8125 | 0 |
| 0.8131944444444444 | 0 |
| 0.813888888888889 | 0 |
| 0.8145833333333333 | 0 |
| 0.8152777777777778 | 0 |
| 0.8159722222222222 | 0 |
| 0.8166666666666668 | 0 |
| 0.8173611111111111 | 0 |
| 0.8180555555555555 | 0 |
| 0.81875 | 0 |
| 0.8194444444444445 | 0 |
| 0.8201388888888889 | 0 |
| 0.8208333333333333 | 0 |
| 0.8215277777777777 | 0 |
| 0.8222222222222223 | 0 |
| 0.8229166666666666 | 0 |
| 0.8236111111111111 | 0 |
| 0.8243055555555556 | 0 |
| 0.8250000000000001 | 0 |
| 0.8256944444444444 | 0 |
| 0.8263888888888888 | 0 |
| 0.8270833333333334 | 0 |
| 0.8277777777777778 | 0 |
| 0.8284722222222222 | 0 |
| 0.8291666666666666 | 0 |
| 0.8298611111111112 | 0 |
| 0.8305555555555556 | 0 |
| 0.8312499999999999 | 0 |
| 0.8319444444444444 | 0 |
| 0.8326388888888889 | 0 |
| 0.8333333333333334 | 0 |
| 0.8340277777777777 | 0 |
| 0.8347222222222223 | 0 |
| 0.8354166666666667 | 0 |
| 0.8361111111111111 | 0 |
| 0.8368055555555555 | 0 |
| 0.8375 | 0 |
| 0.8381944444444445 | 0 |
| 0.8388888888888889 | 0 |
| 0.8395833333333332 | 0 |
| 0.8402777777777778 | 0 |
| 0.8409722222222222 | 0 |
| 0.8416666666666667 | 0 |
| 0.842361111111111 | 0 |
| 0.8430555555555556 | 0 |
| 0.84375 | 0 |
| 0.8444444444444444 | 0 |
| 0.845138888888889 | 0 |
| 0.8458333333333333 | 0 |
| 0.8465277777777778 | 0 |
| 0.8472222222222222 | 0 |
| 0.8479166666666668 | 0 |
| 0.8486111111111111 | 0 |
| 0.8493055555555555 | 0 |
| 0.85 | 0 |
| 0.8506944444444445 | 0 |
| 0.8513888888888889 | 0 |
| 0.8520833333333333 | 0 |
| 0.8527777777777777 | 0 |
| 0.8534722222222223 | 0 |
| 0.8541666666666666 | 0 |
| 0.8548611111111111 | 0 |
| 0.8555555555555556 | 0 |
| 0.8562500000000001 | 0 |
| 0.8569444444444444 | 0 |
| 0.8576388888888888 | 0 |
| 0.8583333333333334 | 0 |
| 0.8590277777777778 | 0 |
| 0.8597222222222222 | 0 |
| 0.8604166666666666 | 0 |
| 0.8611111111111112 | 0 |
| 0.8618055555555556 | 0 |
| 0.8624999999999999 | 0 |
| 0.8631944444444444 | 0 |
| 0.8638888888888889 | 0 |
| 0.8645833333333334 | 0 |
| 0.8652777777777777 | 0 |
| 0.8659722222222223 | 0 |
| 0.8666666666666667 | 0 |
| 0.8673611111111111 | 0 |
| 0.8680555555555555 | 0 |
| 0.86875 | 0 |
| 0.8694444444444445 | 0 |
| 0.8701388888888889 | 0 |
| 0.8708333333333332 | 0 |
| 0.8715277777777778 | 0 |
| 0.8722222222222222 | 0 |
| 0.8729166666666667 | 0 |
| 0.873611111111111 | 0 |
| 0.8743055555555556 | 0 |
| 0.875 | 0 |
| 0.8756944444444444 | 0 |
| 0.876388888888889 | 0 |
| 0.8770833333333333 | 0 |
| 0.8777777777777778 | 0 |
| 0.8784722222222222 | 0 |
| 0.8791666666666668 | 0 |
| 0.8798611111111111 | 0 |
| 0.8805555555555555 | 0 |
| 0.88125 | 0 |
| 0.8819444444444445 | 0 |
| 0.8826388888888889 | 0 |
| 0.8833333333333333 | 0 |
| 0.8840277777777777 | 0 |
| 0.8847222222222223 | 0 |
| 0.8854166666666666 | 0 |
| 0.8861111111111111 | 0 |
| 0.8868055555555556 | 0 |
| 0.8875000000000001 | 0 |
| 0.8881944444444444 | 0 |
| 0.8888888888888888 | 0 |
| 0.8895833333333334 | 0 |
| 0.8902777777777778 | 0 |
| 0.8909722222222222 | 0 |
| 0.8916666666666666 | 0 |
| 0.8923611111111112 | 0 |
| 0.8930555555555556 | 0 |
| 0.8937499999999999 | 0 |
| 0.8944444444444444 | 0 |
| 0.8951388888888889 | 0 |
| 0.8958333333333334 | 0 |
| 0.8965277777777777 | 0 |
| 0.8972222222222223 | 0 |
| 0.8979166666666667 | 0 |
| 0.8986111111111111 | 0 |
| 0.8993055555555555 | 0 |
| 0.9 | 0 |
| 0.9006944444444445 | 0 |
| 0.9013888888888889 | 0 |
| 0.9020833333333332 | 0 |
| 0.9027777777777778 | 0 |
| 0.9034722222222222 | 0 |
| 0.9041666666666667 | 0 |
| 0.904861111111111 | 0 |
| 0.9055555555555556 | 0 |
| 0.90625 | 0 |
| 0.9069444444444444 | 0 |
| 0.907638888888889 | 0 |
| 0.9083333333333333 | 0 |
| 0.9090277777777778 | 0 |
| 0.9097222222222222 | 0 |
| 0.9104166666666668 | 0 |
| 0.9111111111111111 | 0 |
| 0.9118055555555555 | 0 |
| 0.9125 | 0 |
| 0.9131944444444445 | 0 |
| 0.9138888888888889 | 0 |
| 0.9145833333333333 | 0 |
| 0.9152777777777777 | 0 |
| 0.9159722222222223 | 0 |
| 0.9166666666666666 | 0 |
| 0.9173611111111111 | 0 |
| 0.9180555555555556 | 0 |
| 0.9187500000000001 | 0 |
| 0.9194444444444444 | 0 |
| 0.9201388888888888 | 0 |
| 0.9208333333333334 | 0 |
| 0.9215277777777778 | 0 |
| 0.9222222222222222 | 0 |
| 0.9229166666666666 | 0 |
| 0.9236111111111112 | 0 |
| 0.9243055555555556 | 0 |
| 0.9249999999999999 | 0 |
| 0.9256944444444444 | 0 |
| 0.9263888888888889 | 0 |
| 0.9270833333333334 | 0 |
| 0.9277777777777777 | 0 |
| 0.9284722222222223 | 0 |
| 0.9291666666666667 | 0 |
| 0.9298611111111111 | 0 |
| 0.9305555555555555 | 0 |
| 0.93125 | 0 |
| 0.9319444444444445 | 0 |
| 0.9326388888888889 | 0 |
| 0.9333333333333332 | 0 |
| 0.9340277777777778 | 0 |
| 0.9347222222222222 | 0 |
| 0.9354166666666667 | 0 |
| 0.936111111111111 | 0 |
| 0.9368055555555556 | 0 |
| 0.9375 | 0 |
| 0.9381944444444444 | 0 |
| 0.938888888888889 | 0 |
| 0.9395833333333333 | 0 |
| 0.9402777777777778 | 0 |
| 0.9409722222222222 | 0 |
| 0.9416666666666668 | 0 |
| 0.9423611111111111 | 0 |
| 0.9430555555555555 | 0 |
| 0.94375 | 0 |
| 0.9444444444444445 | 0 |
| 0.9451388888888889 | 0 |
| 0.9458333333333333 | 0 |
| 0.9465277777777777 | 0 |
| 0.9472222222222223 | 0 |
| 0.9479166666666666 | 0 |
| 0.9486111111111111 | 0 |
| 0.9493055555555556 | 0 |
| 0.9500000000000001 | 0 |
| 0.9506944444444444 | 0 |
| 0.9513888888888888 | 0 |
| 0.9520833333333334 | 0 |
| 0.9527777777777778 | 0 |
| 0.9534722222222222 | 0 |
| 0.9541666666666666 | 0 |
| 0.9548611111111112 | 0 |
| 0.9555555555555556 | 0 |
| 0.9562499999999999 | 0 |
| 0.9569444444444444 | 0 |
| 0.9576388888888889 | 0 |
| 0.9583333333333334 | 0 |
| 0.9590277777777777 | 0 |
| 0.9597222222222223 | 0 |
| 0.9604166666666667 | 0 |
| 0.9611111111111111 | 0 |
| 0.9618055555555555 | 0 |
| 0.9625 | 0 |
| 0.9631944444444445 | 0 |
| 0.9638888888888889 | 0 |
| 0.9645833333333332 | 0 |
| 0.9652777777777778 | 0 |
| 0.9659722222222222 | 0 |
| 0.9666666666666667 | 0 |
| 0.967361111111111 | 0 |
| 0.9680555555555556 | 0 |
| 0.96875 | 0 |
| 0.9694444444444444 | 0 |
| 0.970138888888889 | 0 |
| 0.9708333333333333 | 0 |
| 0.9715277777777778 | 0 |
| 0.9722222222222222 | 0 |
| 0.9729166666666668 | 0 |
| 0.9736111111111111 | 0 |
| 0.9743055555555555 | 0 |
| 0.975 | 0 |
| 0.9756944444444445 | 0 |
| 0.9763888888888889 | 0 |
| 0.9770833333333333 | 0 |
| 0.9777777777777777 | 0 |
| 0.9784722222222223 | 0 |
| 0.9791666666666666 | 0 |
| 0.9798611111111111 | 0 |
| 0.9805555555555556 | 0 |
| 0.9812500000000001 | 0 |
| 0.9819444444444444 | 0 |
| 0.9826388888888888 | 0 |
| 0.9833333333333334 | 0 |
| 0.9840277777777778 | 0 |
| 0.9847222222222222 | 0 |
| 0.9854166666666666 | 0 |
| 0.9861111111111112 | 0 |
| 0.9868055555555556 | 0 |
| 0.9874999999999999 | 0 |
| 0.9881944444444444 | 0 |
| 0.9888888888888889 | 0 |
| 0.9895833333333334 | 0 |
| 0.9902777777777777 | 0 |
| 0.9909722222222223 | 0 |
| 0.9916666666666667 | 0 |
| 0.9923611111111111 | 0 |
| 0.9930555555555555 | 0 |
| 0.99375 | 0 |
| 0.9944444444444445 | 0 |
| 0.9951388888888889 | 0 |
| 0.9958333333333332 | 0 |
| 0.9965277777777778 | 0 |
| 0.9972222222222222 | 0 |
| 0.9979166666666667 | 0 |
| 0.998611111111111 | 0 |
| 0.9993055555555556 | 0 |